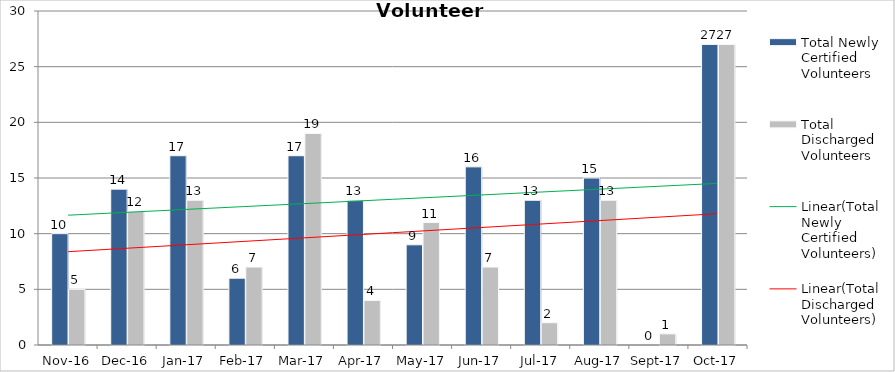
| Category | Total Newly Certified Volunteers | Total Discharged Volunteers |
|---|---|---|
| 2016-11-01 | 10 | 5 |
| 2016-12-01 | 14 | 12 |
| 2017-01-01 | 17 | 13 |
| 2017-02-01 | 6 | 7 |
| 2017-03-01 | 17 | 19 |
| 2017-04-01 | 13 | 4 |
| 2017-05-01 | 9 | 11 |
| 2017-06-01 | 16 | 7 |
| 2017-07-01 | 13 | 2 |
| 2017-08-01 | 15 | 13 |
| 2017-09-01 | 0 | 1 |
| 2017-10-01 | 27 | 27 |